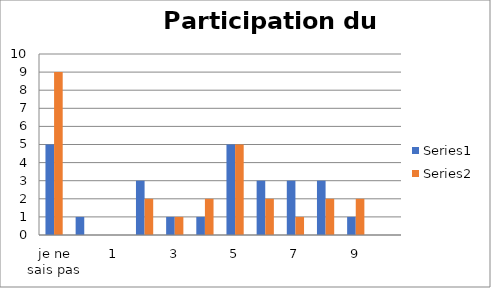
| Category | Series 0 | Series 1 |
|---|---|---|
| je ne sais pas | 5 | 9 |
| 0 | 1 | 0 |
| 1 | 0 | 0 |
| 2 | 3 | 2 |
| 3 | 1 | 1 |
| 4 | 1 | 2 |
| 5 | 5 | 5 |
| 6 | 3 | 2 |
| 7 | 3 | 1 |
| 8 | 3 | 2 |
| 9 | 1 | 2 |
| 10 | 0 | 0 |